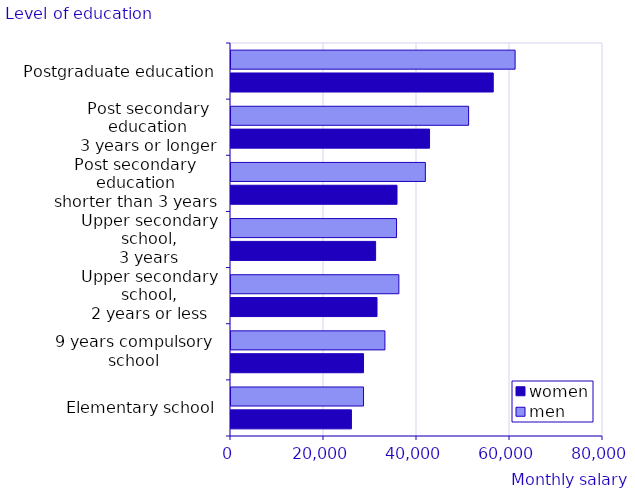
| Category | women | men |
|---|---|---|
| Elementary school | 25900 | 28500 |
| 9 years compulsory
school | 28500 | 33100 |
| Upper secondary school,
2 years or less | 31400 | 36100 |
| Upper secondary school,
3 years | 31100 | 35600 |
| Post secondary education
shorter than 3 years | 35700 | 41800 |
| Post secondary education
3 years or longer | 42700 | 51100 |
| Postgraduate education | 56400 | 61100 |